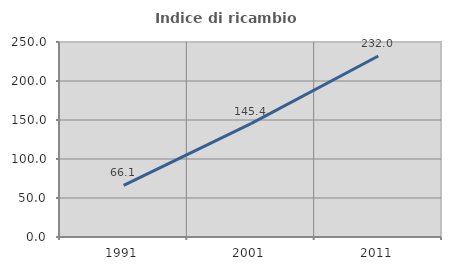
| Category | Indice di ricambio occupazionale  |
|---|---|
| 1991.0 | 66.138 |
| 2001.0 | 145.37 |
| 2011.0 | 232 |